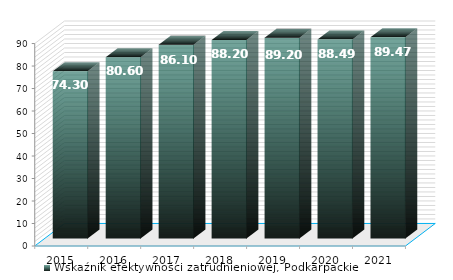
| Category | Wskaźnik efektywności zatrudnieniowej, Podkarpackie |
|---|---|
| 2015.0 | 74.3 |
| 2016.0 | 80.6 |
| 2017.0 | 86.1 |
| 2018.0 | 88.2 |
| 2019.0 | 89.2 |
| 2020.0 | 88.495 |
| 2021.0 | 89.471 |